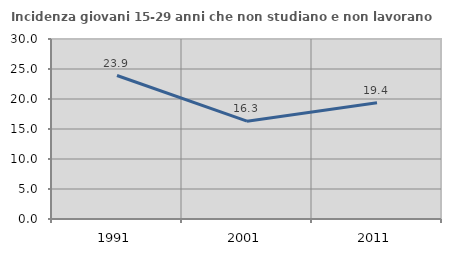
| Category | Incidenza giovani 15-29 anni che non studiano e non lavorano  |
|---|---|
| 1991.0 | 23.913 |
| 2001.0 | 16.3 |
| 2011.0 | 19.37 |